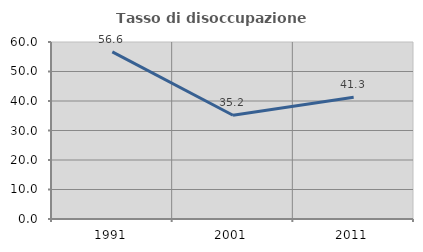
| Category | Tasso di disoccupazione giovanile  |
|---|---|
| 1991.0 | 56.637 |
| 2001.0 | 35.185 |
| 2011.0 | 41.304 |